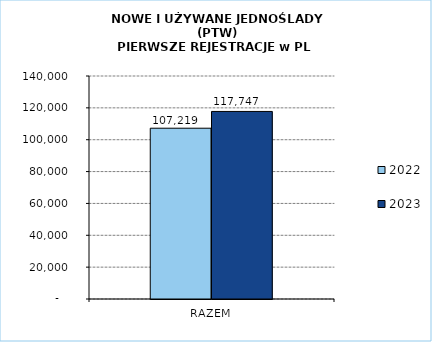
| Category | 2022 | 2023 |
|---|---|---|
| RAZEM | 107219 | 117747 |